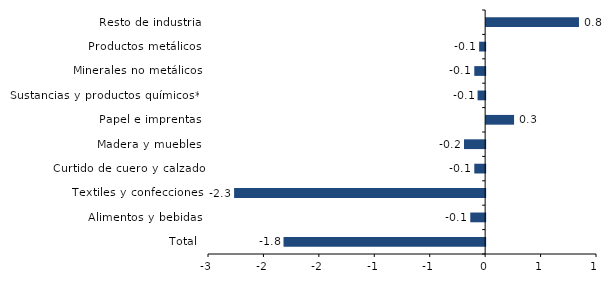
| Category | Series 0 |
|---|---|
| Total | -1.819 |
| Alimentos y bebidas | -0.134 |
| Textiles y confecciones | -2.265 |
| Curtido de cuero y calzado | -0.098 |
| Madera y muebles | -0.191 |
| Papel e imprentas | 0.252 |
| Sustancias y productos químicos** | -0.068 |
| Minerales no metálicos | -0.098 |
| Productos metálicos | -0.054 |
| Resto de industria | 0.837 |